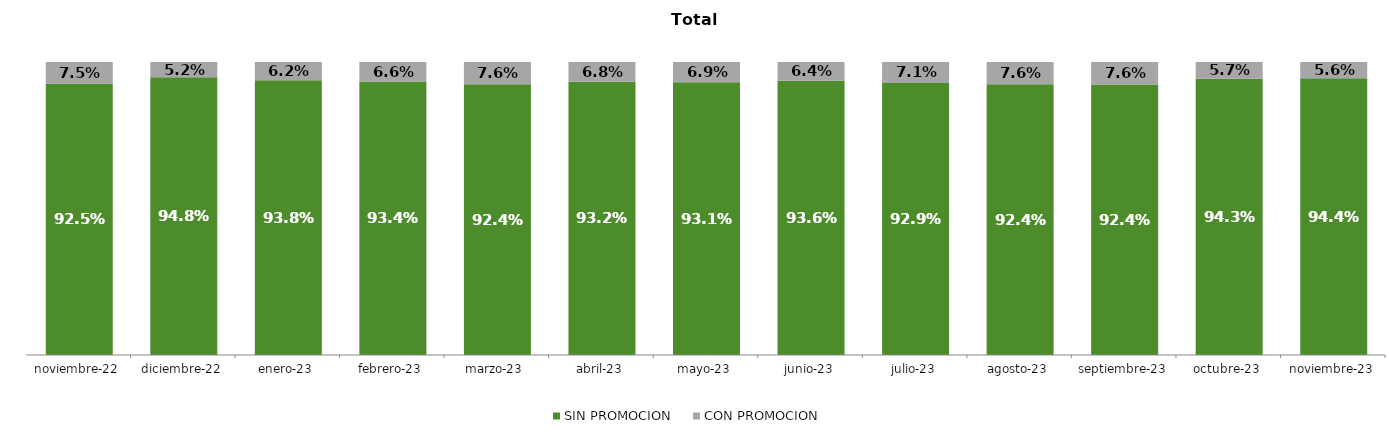
| Category | SIN PROMOCION   | CON PROMOCION   |
|---|---|---|
| 2022-11-01 | 0.925 | 0.075 |
| 2022-12-01 | 0.948 | 0.052 |
| 2023-01-01 | 0.938 | 0.062 |
| 2023-02-01 | 0.934 | 0.066 |
| 2023-03-01 | 0.924 | 0.076 |
| 2023-04-01 | 0.932 | 0.068 |
| 2023-05-01 | 0.931 | 0.069 |
| 2023-06-01 | 0.936 | 0.064 |
| 2023-07-01 | 0.929 | 0.071 |
| 2023-08-01 | 0.924 | 0.076 |
| 2023-09-01 | 0.924 | 0.076 |
| 2023-10-01 | 0.943 | 0.057 |
| 2023-11-01 | 0.944 | 0.056 |